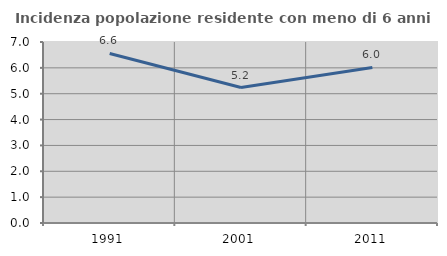
| Category | Incidenza popolazione residente con meno di 6 anni |
|---|---|
| 1991.0 | 6.557 |
| 2001.0 | 5.24 |
| 2011.0 | 6.014 |